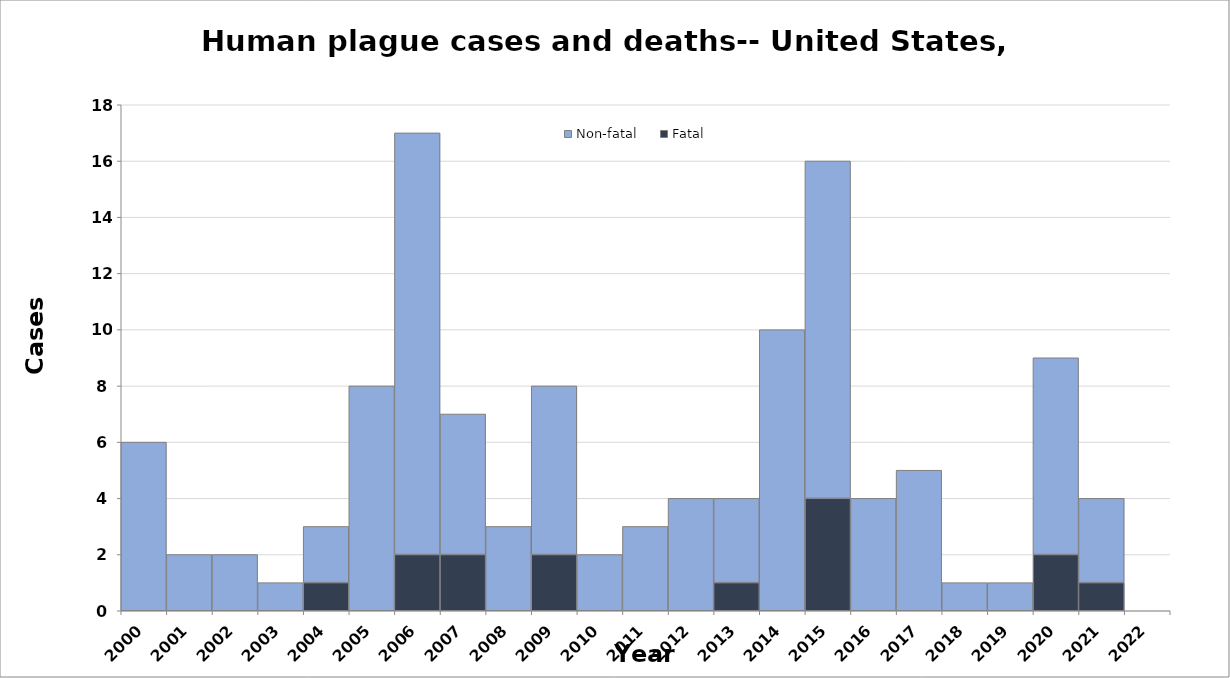
| Category | Fatal | Non-fatal |
|---|---|---|
| 2000.0 | 0 | 6 |
| 2001.0 | 0 | 2 |
| 2002.0 | 0 | 2 |
| 2003.0 | 0 | 1 |
| 2004.0 | 1 | 2 |
| 2005.0 | 0 | 8 |
| 2006.0 | 2 | 15 |
| 2007.0 | 2 | 5 |
| 2008.0 | 0 | 3 |
| 2009.0 | 2 | 6 |
| 2010.0 | 0 | 2 |
| 2011.0 | 0 | 3 |
| 2012.0 | 0 | 4 |
| 2013.0 | 1 | 3 |
| 2014.0 | 0 | 10 |
| 2015.0 | 4 | 12 |
| 2016.0 | 0 | 4 |
| 2017.0 | 0 | 5 |
| 2018.0 | 0 | 1 |
| 2019.0 | 0 | 1 |
| 2020.0 | 2 | 7 |
| 2021.0 | 1 | 3 |
| 2022.0 | 0 | 0 |